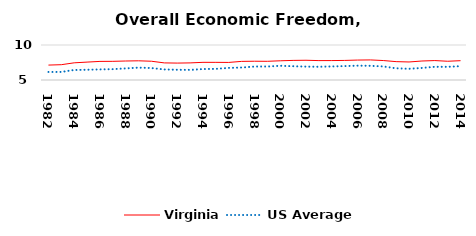
| Category | Virginia | US Average |
|---|---|---|
| 1982.0 | 7.131 | 6.149 |
| 1983.0 | 7.186 | 6.152 |
| 1984.0 | 7.453 | 6.429 |
| 1985.0 | 7.558 | 6.464 |
| 1986.0 | 7.658 | 6.512 |
| 1987.0 | 7.665 | 6.552 |
| 1988.0 | 7.713 | 6.659 |
| 1989.0 | 7.742 | 6.767 |
| 1990.0 | 7.679 | 6.71 |
| 1991.0 | 7.443 | 6.502 |
| 1992.0 | 7.415 | 6.463 |
| 1993.0 | 7.444 | 6.446 |
| 1994.0 | 7.522 | 6.563 |
| 1995.0 | 7.521 | 6.593 |
| 1996.0 | 7.51 | 6.73 |
| 1997.0 | 7.661 | 6.781 |
| 1998.0 | 7.681 | 6.926 |
| 1999.0 | 7.671 | 6.925 |
| 2000.0 | 7.744 | 7.031 |
| 2001.0 | 7.8 | 6.969 |
| 2002.0 | 7.82 | 6.912 |
| 2003.0 | 7.77 | 6.892 |
| 2004.0 | 7.777 | 6.934 |
| 2005.0 | 7.796 | 6.99 |
| 2006.0 | 7.848 | 7.048 |
| 2007.0 | 7.866 | 7.028 |
| 2008.0 | 7.78 | 6.935 |
| 2009.0 | 7.623 | 6.668 |
| 2010.0 | 7.575 | 6.605 |
| 2011.0 | 7.712 | 6.72 |
| 2012.0 | 7.777 | 6.883 |
| 2013.0 | 7.677 | 6.881 |
| 2014.0 | 7.76 | 6.973 |